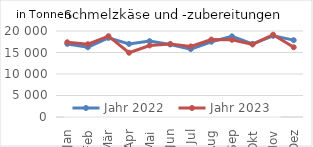
| Category | Jahr 2022 | Jahr 2023 |
|---|---|---|
| Jan | 16998.18 | 17381.788 |
| Feb | 16227.912 | 16919.001 |
| Mär | 18398.223 | 18799.53 |
| Apr | 16990.404 | 14941.827 |
| Mai | 17643.947 | 16633.551 |
| Jun | 16867.96 | 17001.288 |
| Jul | 15794.732 | 16409.477 |
| Aug | 17501.983 | 18014.845 |
| Sep | 18760.121 | 17959.046 |
| Okt | 16993.541 | 16871.986 |
| Nov | 18868.081 | 19142.169 |
| Dez | 17871.851 | 16210.191 |